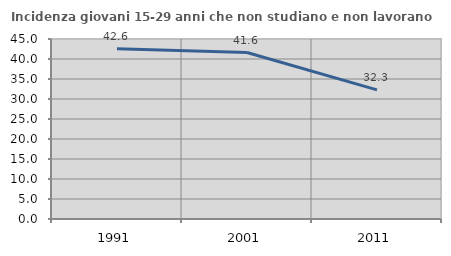
| Category | Incidenza giovani 15-29 anni che non studiano e non lavorano  |
|---|---|
| 1991.0 | 42.577 |
| 2001.0 | 41.611 |
| 2011.0 | 32.271 |